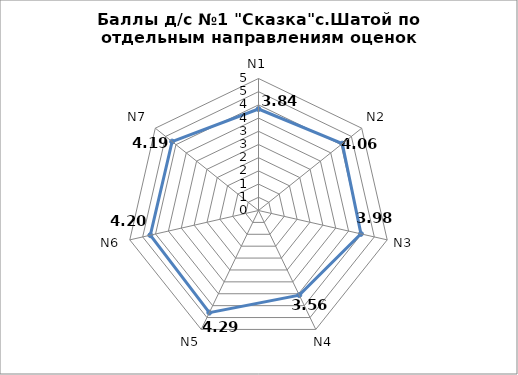
| Category | Series 0 |
|---|---|
| N1 | 3.844 |
| N2 | 4.06 |
| N3 | 3.98 |
| N4 | 3.558 |
| N5 | 4.293 |
| N6 | 4.202 |
| N7 | 4.186 |